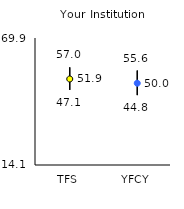
| Category | 25th | 75th | Mean |
|---|---|---|---|
| TFS | 47.1 | 57 | 51.89 |
| YFCY | 44.8 | 55.6 | 50.03 |